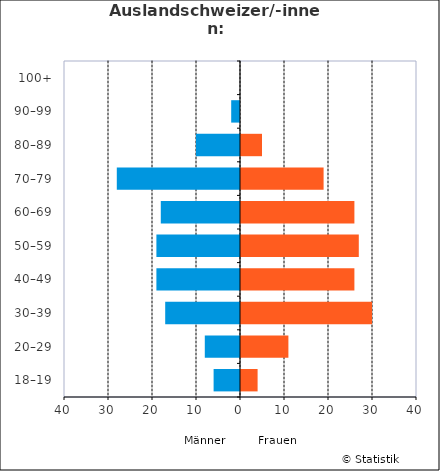
| Category | Männer | Frauen |
|---|---|---|
| 18–19 | -6 | 4 |
| 20–29 | -8 | 11 |
| 30–39 | -17 | 30 |
| 40–49 | -19 | 26 |
| 50–59 | -19 | 27 |
| 60–69 | -18 | 26 |
| 70–79 | -28 | 19 |
| 80–89 | -10 | 5 |
| 90–99 | -2 | 0 |
| 100+ | 0 | 0 |